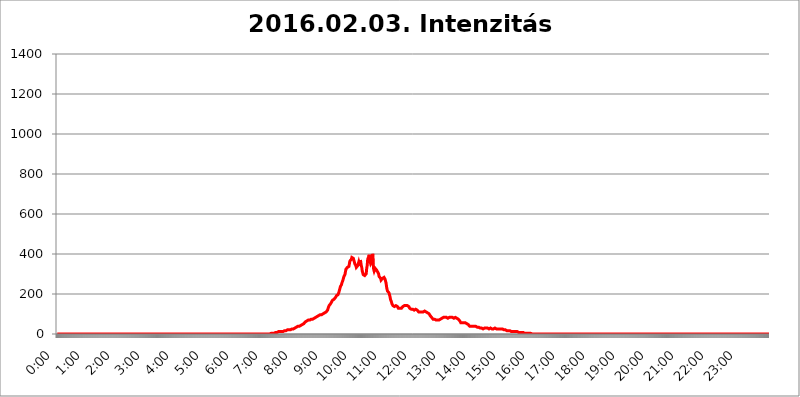
| Category | 2016.02.03. Intenzitás [W/m^2] |
|---|---|
| 0.0 | 0 |
| 0.0006944444444444445 | 0 |
| 0.001388888888888889 | 0 |
| 0.0020833333333333333 | 0 |
| 0.002777777777777778 | 0 |
| 0.003472222222222222 | 0 |
| 0.004166666666666667 | 0 |
| 0.004861111111111111 | 0 |
| 0.005555555555555556 | 0 |
| 0.0062499999999999995 | 0 |
| 0.006944444444444444 | 0 |
| 0.007638888888888889 | 0 |
| 0.008333333333333333 | 0 |
| 0.009027777777777779 | 0 |
| 0.009722222222222222 | 0 |
| 0.010416666666666666 | 0 |
| 0.011111111111111112 | 0 |
| 0.011805555555555555 | 0 |
| 0.012499999999999999 | 0 |
| 0.013194444444444444 | 0 |
| 0.013888888888888888 | 0 |
| 0.014583333333333332 | 0 |
| 0.015277777777777777 | 0 |
| 0.015972222222222224 | 0 |
| 0.016666666666666666 | 0 |
| 0.017361111111111112 | 0 |
| 0.018055555555555557 | 0 |
| 0.01875 | 0 |
| 0.019444444444444445 | 0 |
| 0.02013888888888889 | 0 |
| 0.020833333333333332 | 0 |
| 0.02152777777777778 | 0 |
| 0.022222222222222223 | 0 |
| 0.02291666666666667 | 0 |
| 0.02361111111111111 | 0 |
| 0.024305555555555556 | 0 |
| 0.024999999999999998 | 0 |
| 0.025694444444444447 | 0 |
| 0.02638888888888889 | 0 |
| 0.027083333333333334 | 0 |
| 0.027777777777777776 | 0 |
| 0.02847222222222222 | 0 |
| 0.029166666666666664 | 0 |
| 0.029861111111111113 | 0 |
| 0.030555555555555555 | 0 |
| 0.03125 | 0 |
| 0.03194444444444445 | 0 |
| 0.03263888888888889 | 0 |
| 0.03333333333333333 | 0 |
| 0.034027777777777775 | 0 |
| 0.034722222222222224 | 0 |
| 0.035416666666666666 | 0 |
| 0.036111111111111115 | 0 |
| 0.03680555555555556 | 0 |
| 0.0375 | 0 |
| 0.03819444444444444 | 0 |
| 0.03888888888888889 | 0 |
| 0.03958333333333333 | 0 |
| 0.04027777777777778 | 0 |
| 0.04097222222222222 | 0 |
| 0.041666666666666664 | 0 |
| 0.042361111111111106 | 0 |
| 0.04305555555555556 | 0 |
| 0.043750000000000004 | 0 |
| 0.044444444444444446 | 0 |
| 0.04513888888888889 | 0 |
| 0.04583333333333334 | 0 |
| 0.04652777777777778 | 0 |
| 0.04722222222222222 | 0 |
| 0.04791666666666666 | 0 |
| 0.04861111111111111 | 0 |
| 0.049305555555555554 | 0 |
| 0.049999999999999996 | 0 |
| 0.05069444444444445 | 0 |
| 0.051388888888888894 | 0 |
| 0.052083333333333336 | 0 |
| 0.05277777777777778 | 0 |
| 0.05347222222222222 | 0 |
| 0.05416666666666667 | 0 |
| 0.05486111111111111 | 0 |
| 0.05555555555555555 | 0 |
| 0.05625 | 0 |
| 0.05694444444444444 | 0 |
| 0.057638888888888885 | 0 |
| 0.05833333333333333 | 0 |
| 0.05902777777777778 | 0 |
| 0.059722222222222225 | 0 |
| 0.06041666666666667 | 0 |
| 0.061111111111111116 | 0 |
| 0.06180555555555556 | 0 |
| 0.0625 | 0 |
| 0.06319444444444444 | 0 |
| 0.06388888888888888 | 0 |
| 0.06458333333333334 | 0 |
| 0.06527777777777778 | 0 |
| 0.06597222222222222 | 0 |
| 0.06666666666666667 | 0 |
| 0.06736111111111111 | 0 |
| 0.06805555555555555 | 0 |
| 0.06874999999999999 | 0 |
| 0.06944444444444443 | 0 |
| 0.07013888888888889 | 0 |
| 0.07083333333333333 | 0 |
| 0.07152777777777779 | 0 |
| 0.07222222222222223 | 0 |
| 0.07291666666666667 | 0 |
| 0.07361111111111111 | 0 |
| 0.07430555555555556 | 0 |
| 0.075 | 0 |
| 0.07569444444444444 | 0 |
| 0.0763888888888889 | 0 |
| 0.07708333333333334 | 0 |
| 0.07777777777777778 | 0 |
| 0.07847222222222222 | 0 |
| 0.07916666666666666 | 0 |
| 0.0798611111111111 | 0 |
| 0.08055555555555556 | 0 |
| 0.08125 | 0 |
| 0.08194444444444444 | 0 |
| 0.08263888888888889 | 0 |
| 0.08333333333333333 | 0 |
| 0.08402777777777777 | 0 |
| 0.08472222222222221 | 0 |
| 0.08541666666666665 | 0 |
| 0.08611111111111112 | 0 |
| 0.08680555555555557 | 0 |
| 0.08750000000000001 | 0 |
| 0.08819444444444445 | 0 |
| 0.08888888888888889 | 0 |
| 0.08958333333333333 | 0 |
| 0.09027777777777778 | 0 |
| 0.09097222222222222 | 0 |
| 0.09166666666666667 | 0 |
| 0.09236111111111112 | 0 |
| 0.09305555555555556 | 0 |
| 0.09375 | 0 |
| 0.09444444444444444 | 0 |
| 0.09513888888888888 | 0 |
| 0.09583333333333333 | 0 |
| 0.09652777777777777 | 0 |
| 0.09722222222222222 | 0 |
| 0.09791666666666667 | 0 |
| 0.09861111111111111 | 0 |
| 0.09930555555555555 | 0 |
| 0.09999999999999999 | 0 |
| 0.10069444444444443 | 0 |
| 0.1013888888888889 | 0 |
| 0.10208333333333335 | 0 |
| 0.10277777777777779 | 0 |
| 0.10347222222222223 | 0 |
| 0.10416666666666667 | 0 |
| 0.10486111111111111 | 0 |
| 0.10555555555555556 | 0 |
| 0.10625 | 0 |
| 0.10694444444444444 | 0 |
| 0.1076388888888889 | 0 |
| 0.10833333333333334 | 0 |
| 0.10902777777777778 | 0 |
| 0.10972222222222222 | 0 |
| 0.1111111111111111 | 0 |
| 0.11180555555555556 | 0 |
| 0.11180555555555556 | 0 |
| 0.1125 | 0 |
| 0.11319444444444444 | 0 |
| 0.11388888888888889 | 0 |
| 0.11458333333333333 | 0 |
| 0.11527777777777777 | 0 |
| 0.11597222222222221 | 0 |
| 0.11666666666666665 | 0 |
| 0.1173611111111111 | 0 |
| 0.11805555555555557 | 0 |
| 0.11944444444444445 | 0 |
| 0.12013888888888889 | 0 |
| 0.12083333333333333 | 0 |
| 0.12152777777777778 | 0 |
| 0.12222222222222223 | 0 |
| 0.12291666666666667 | 0 |
| 0.12291666666666667 | 0 |
| 0.12361111111111112 | 0 |
| 0.12430555555555556 | 0 |
| 0.125 | 0 |
| 0.12569444444444444 | 0 |
| 0.12638888888888888 | 0 |
| 0.12708333333333333 | 0 |
| 0.16875 | 0 |
| 0.12847222222222224 | 0 |
| 0.12916666666666668 | 0 |
| 0.12986111111111112 | 0 |
| 0.13055555555555556 | 0 |
| 0.13125 | 0 |
| 0.13194444444444445 | 0 |
| 0.1326388888888889 | 0 |
| 0.13333333333333333 | 0 |
| 0.13402777777777777 | 0 |
| 0.13402777777777777 | 0 |
| 0.13472222222222222 | 0 |
| 0.13541666666666666 | 0 |
| 0.1361111111111111 | 0 |
| 0.13749999999999998 | 0 |
| 0.13819444444444443 | 0 |
| 0.1388888888888889 | 0 |
| 0.13958333333333334 | 0 |
| 0.14027777777777778 | 0 |
| 0.14097222222222222 | 0 |
| 0.14166666666666666 | 0 |
| 0.1423611111111111 | 0 |
| 0.14305555555555557 | 0 |
| 0.14375000000000002 | 0 |
| 0.14444444444444446 | 0 |
| 0.1451388888888889 | 0 |
| 0.1451388888888889 | 0 |
| 0.14652777777777778 | 0 |
| 0.14722222222222223 | 0 |
| 0.14791666666666667 | 0 |
| 0.1486111111111111 | 0 |
| 0.14930555555555555 | 0 |
| 0.15 | 0 |
| 0.15069444444444444 | 0 |
| 0.15138888888888888 | 0 |
| 0.15208333333333332 | 0 |
| 0.15277777777777776 | 0 |
| 0.15347222222222223 | 0 |
| 0.15416666666666667 | 0 |
| 0.15486111111111112 | 0 |
| 0.15555555555555556 | 0 |
| 0.15625 | 0 |
| 0.15694444444444444 | 0 |
| 0.15763888888888888 | 0 |
| 0.15833333333333333 | 0 |
| 0.15902777777777777 | 0 |
| 0.15972222222222224 | 0 |
| 0.16041666666666668 | 0 |
| 0.16111111111111112 | 0 |
| 0.16180555555555556 | 0 |
| 0.1625 | 0 |
| 0.16319444444444445 | 0 |
| 0.1638888888888889 | 0 |
| 0.16458333333333333 | 0 |
| 0.16527777777777777 | 0 |
| 0.16597222222222222 | 0 |
| 0.16666666666666666 | 0 |
| 0.1673611111111111 | 0 |
| 0.16805555555555554 | 0 |
| 0.16874999999999998 | 0 |
| 0.16944444444444443 | 0 |
| 0.17013888888888887 | 0 |
| 0.1708333333333333 | 0 |
| 0.17152777777777775 | 0 |
| 0.17222222222222225 | 0 |
| 0.1729166666666667 | 0 |
| 0.17361111111111113 | 0 |
| 0.17430555555555557 | 0 |
| 0.17500000000000002 | 0 |
| 0.17569444444444446 | 0 |
| 0.1763888888888889 | 0 |
| 0.17708333333333334 | 0 |
| 0.17777777777777778 | 0 |
| 0.17847222222222223 | 0 |
| 0.17916666666666667 | 0 |
| 0.1798611111111111 | 0 |
| 0.18055555555555555 | 0 |
| 0.18125 | 0 |
| 0.18194444444444444 | 0 |
| 0.1826388888888889 | 0 |
| 0.18333333333333335 | 0 |
| 0.1840277777777778 | 0 |
| 0.18472222222222223 | 0 |
| 0.18541666666666667 | 0 |
| 0.18611111111111112 | 0 |
| 0.18680555555555556 | 0 |
| 0.1875 | 0 |
| 0.18819444444444444 | 0 |
| 0.18888888888888888 | 0 |
| 0.18958333333333333 | 0 |
| 0.19027777777777777 | 0 |
| 0.1909722222222222 | 0 |
| 0.19166666666666665 | 0 |
| 0.19236111111111112 | 0 |
| 0.19305555555555554 | 0 |
| 0.19375 | 0 |
| 0.19444444444444445 | 0 |
| 0.1951388888888889 | 0 |
| 0.19583333333333333 | 0 |
| 0.19652777777777777 | 0 |
| 0.19722222222222222 | 0 |
| 0.19791666666666666 | 0 |
| 0.1986111111111111 | 0 |
| 0.19930555555555554 | 0 |
| 0.19999999999999998 | 0 |
| 0.20069444444444443 | 0 |
| 0.20138888888888887 | 0 |
| 0.2020833333333333 | 0 |
| 0.2027777777777778 | 0 |
| 0.2034722222222222 | 0 |
| 0.2041666666666667 | 0 |
| 0.20486111111111113 | 0 |
| 0.20555555555555557 | 0 |
| 0.20625000000000002 | 0 |
| 0.20694444444444446 | 0 |
| 0.2076388888888889 | 0 |
| 0.20833333333333334 | 0 |
| 0.20902777777777778 | 0 |
| 0.20972222222222223 | 0 |
| 0.21041666666666667 | 0 |
| 0.2111111111111111 | 0 |
| 0.21180555555555555 | 0 |
| 0.2125 | 0 |
| 0.21319444444444444 | 0 |
| 0.2138888888888889 | 0 |
| 0.21458333333333335 | 0 |
| 0.2152777777777778 | 0 |
| 0.21597222222222223 | 0 |
| 0.21666666666666667 | 0 |
| 0.21736111111111112 | 0 |
| 0.21805555555555556 | 0 |
| 0.21875 | 0 |
| 0.21944444444444444 | 0 |
| 0.22013888888888888 | 0 |
| 0.22083333333333333 | 0 |
| 0.22152777777777777 | 0 |
| 0.2222222222222222 | 0 |
| 0.22291666666666665 | 0 |
| 0.2236111111111111 | 0 |
| 0.22430555555555556 | 0 |
| 0.225 | 0 |
| 0.22569444444444445 | 0 |
| 0.2263888888888889 | 0 |
| 0.22708333333333333 | 0 |
| 0.22777777777777777 | 0 |
| 0.22847222222222222 | 0 |
| 0.22916666666666666 | 0 |
| 0.2298611111111111 | 0 |
| 0.23055555555555554 | 0 |
| 0.23124999999999998 | 0 |
| 0.23194444444444443 | 0 |
| 0.23263888888888887 | 0 |
| 0.2333333333333333 | 0 |
| 0.2340277777777778 | 0 |
| 0.2347222222222222 | 0 |
| 0.2354166666666667 | 0 |
| 0.23611111111111113 | 0 |
| 0.23680555555555557 | 0 |
| 0.23750000000000002 | 0 |
| 0.23819444444444446 | 0 |
| 0.2388888888888889 | 0 |
| 0.23958333333333334 | 0 |
| 0.24027777777777778 | 0 |
| 0.24097222222222223 | 0 |
| 0.24166666666666667 | 0 |
| 0.2423611111111111 | 0 |
| 0.24305555555555555 | 0 |
| 0.24375 | 0 |
| 0.24444444444444446 | 0 |
| 0.24513888888888888 | 0 |
| 0.24583333333333335 | 0 |
| 0.2465277777777778 | 0 |
| 0.24722222222222223 | 0 |
| 0.24791666666666667 | 0 |
| 0.24861111111111112 | 0 |
| 0.24930555555555556 | 0 |
| 0.25 | 0 |
| 0.25069444444444444 | 0 |
| 0.2513888888888889 | 0 |
| 0.2520833333333333 | 0 |
| 0.25277777777777777 | 0 |
| 0.2534722222222222 | 0 |
| 0.25416666666666665 | 0 |
| 0.2548611111111111 | 0 |
| 0.2555555555555556 | 0 |
| 0.25625000000000003 | 0 |
| 0.2569444444444445 | 0 |
| 0.2576388888888889 | 0 |
| 0.25833333333333336 | 0 |
| 0.2590277777777778 | 0 |
| 0.25972222222222224 | 0 |
| 0.2604166666666667 | 0 |
| 0.2611111111111111 | 0 |
| 0.26180555555555557 | 0 |
| 0.2625 | 0 |
| 0.26319444444444445 | 0 |
| 0.2638888888888889 | 0 |
| 0.26458333333333334 | 0 |
| 0.2652777777777778 | 0 |
| 0.2659722222222222 | 0 |
| 0.26666666666666666 | 0 |
| 0.2673611111111111 | 0 |
| 0.26805555555555555 | 0 |
| 0.26875 | 0 |
| 0.26944444444444443 | 0 |
| 0.2701388888888889 | 0 |
| 0.2708333333333333 | 0 |
| 0.27152777777777776 | 0 |
| 0.2722222222222222 | 0 |
| 0.27291666666666664 | 0 |
| 0.2736111111111111 | 0 |
| 0.2743055555555555 | 0 |
| 0.27499999999999997 | 0 |
| 0.27569444444444446 | 0 |
| 0.27638888888888885 | 0 |
| 0.27708333333333335 | 0 |
| 0.2777777777777778 | 0 |
| 0.27847222222222223 | 0 |
| 0.2791666666666667 | 0 |
| 0.2798611111111111 | 0 |
| 0.28055555555555556 | 0 |
| 0.28125 | 0 |
| 0.28194444444444444 | 0 |
| 0.2826388888888889 | 0 |
| 0.2833333333333333 | 0 |
| 0.28402777777777777 | 0 |
| 0.2847222222222222 | 0 |
| 0.28541666666666665 | 0 |
| 0.28611111111111115 | 0 |
| 0.28680555555555554 | 0 |
| 0.28750000000000003 | 0 |
| 0.2881944444444445 | 0 |
| 0.2888888888888889 | 0 |
| 0.28958333333333336 | 0 |
| 0.2902777777777778 | 0 |
| 0.29097222222222224 | 0 |
| 0.2916666666666667 | 0 |
| 0.2923611111111111 | 0 |
| 0.29305555555555557 | 0 |
| 0.29375 | 0 |
| 0.29444444444444445 | 0 |
| 0.2951388888888889 | 0 |
| 0.29583333333333334 | 0 |
| 0.2965277777777778 | 0 |
| 0.2972222222222222 | 0 |
| 0.29791666666666666 | 0 |
| 0.2986111111111111 | 3.525 |
| 0.29930555555555555 | 3.525 |
| 0.3 | 3.525 |
| 0.30069444444444443 | 3.525 |
| 0.3013888888888889 | 3.525 |
| 0.3020833333333333 | 3.525 |
| 0.30277777777777776 | 3.525 |
| 0.3034722222222222 | 3.525 |
| 0.30416666666666664 | 3.525 |
| 0.3048611111111111 | 3.525 |
| 0.3055555555555555 | 7.887 |
| 0.30624999999999997 | 7.887 |
| 0.3069444444444444 | 7.887 |
| 0.3076388888888889 | 7.887 |
| 0.30833333333333335 | 7.887 |
| 0.3090277777777778 | 12.257 |
| 0.30972222222222223 | 12.257 |
| 0.3104166666666667 | 12.257 |
| 0.3111111111111111 | 12.257 |
| 0.31180555555555556 | 12.257 |
| 0.3125 | 12.257 |
| 0.31319444444444444 | 12.257 |
| 0.3138888888888889 | 12.257 |
| 0.3145833333333333 | 12.257 |
| 0.31527777777777777 | 12.257 |
| 0.3159722222222222 | 12.257 |
| 0.31666666666666665 | 12.257 |
| 0.31736111111111115 | 16.636 |
| 0.31805555555555554 | 16.636 |
| 0.31875000000000003 | 16.636 |
| 0.3194444444444445 | 16.636 |
| 0.3201388888888889 | 16.636 |
| 0.32083333333333336 | 16.636 |
| 0.3215277777777778 | 16.636 |
| 0.32222222222222224 | 21.024 |
| 0.3229166666666667 | 21.024 |
| 0.3236111111111111 | 21.024 |
| 0.32430555555555557 | 21.024 |
| 0.325 | 21.024 |
| 0.32569444444444445 | 21.024 |
| 0.3263888888888889 | 21.024 |
| 0.32708333333333334 | 21.024 |
| 0.3277777777777778 | 21.024 |
| 0.3284722222222222 | 21.024 |
| 0.32916666666666666 | 25.419 |
| 0.3298611111111111 | 25.419 |
| 0.33055555555555555 | 25.419 |
| 0.33125 | 25.419 |
| 0.33194444444444443 | 25.419 |
| 0.3326388888888889 | 25.419 |
| 0.3333333333333333 | 29.823 |
| 0.3340277777777778 | 29.823 |
| 0.3347222222222222 | 29.823 |
| 0.3354166666666667 | 34.234 |
| 0.3361111111111111 | 34.234 |
| 0.3368055555555556 | 34.234 |
| 0.33749999999999997 | 38.653 |
| 0.33819444444444446 | 38.653 |
| 0.33888888888888885 | 38.653 |
| 0.33958333333333335 | 38.653 |
| 0.34027777777777773 | 38.653 |
| 0.34097222222222223 | 43.079 |
| 0.3416666666666666 | 43.079 |
| 0.3423611111111111 | 47.511 |
| 0.3430555555555555 | 47.511 |
| 0.34375 | 47.511 |
| 0.3444444444444445 | 51.951 |
| 0.3451388888888889 | 51.951 |
| 0.3458333333333334 | 51.951 |
| 0.34652777777777777 | 56.398 |
| 0.34722222222222227 | 56.398 |
| 0.34791666666666665 | 60.85 |
| 0.34861111111111115 | 60.85 |
| 0.34930555555555554 | 60.85 |
| 0.35000000000000003 | 65.31 |
| 0.3506944444444444 | 65.31 |
| 0.3513888888888889 | 69.775 |
| 0.3520833333333333 | 69.775 |
| 0.3527777777777778 | 69.775 |
| 0.3534722222222222 | 69.775 |
| 0.3541666666666667 | 69.775 |
| 0.3548611111111111 | 69.775 |
| 0.35555555555555557 | 69.775 |
| 0.35625 | 74.246 |
| 0.35694444444444445 | 74.246 |
| 0.3576388888888889 | 74.246 |
| 0.35833333333333334 | 74.246 |
| 0.3590277777777778 | 74.246 |
| 0.3597222222222222 | 74.246 |
| 0.36041666666666666 | 78.722 |
| 0.3611111111111111 | 78.722 |
| 0.36180555555555555 | 78.722 |
| 0.3625 | 83.205 |
| 0.36319444444444443 | 83.205 |
| 0.3638888888888889 | 87.692 |
| 0.3645833333333333 | 87.692 |
| 0.3652777777777778 | 92.184 |
| 0.3659722222222222 | 92.184 |
| 0.3666666666666667 | 92.184 |
| 0.3673611111111111 | 92.184 |
| 0.3680555555555556 | 96.682 |
| 0.36874999999999997 | 96.682 |
| 0.36944444444444446 | 96.682 |
| 0.37013888888888885 | 96.682 |
| 0.37083333333333335 | 96.682 |
| 0.37152777777777773 | 96.682 |
| 0.37222222222222223 | 101.184 |
| 0.3729166666666666 | 101.184 |
| 0.3736111111111111 | 101.184 |
| 0.3743055555555555 | 105.69 |
| 0.375 | 105.69 |
| 0.3756944444444445 | 105.69 |
| 0.3763888888888889 | 110.201 |
| 0.3770833333333334 | 110.201 |
| 0.37777777777777777 | 110.201 |
| 0.37847222222222227 | 114.716 |
| 0.37916666666666665 | 119.235 |
| 0.37986111111111115 | 128.284 |
| 0.38055555555555554 | 132.814 |
| 0.38125000000000003 | 141.884 |
| 0.3819444444444444 | 146.423 |
| 0.3826388888888889 | 146.423 |
| 0.3833333333333333 | 150.964 |
| 0.3840277777777778 | 155.509 |
| 0.3847222222222222 | 160.056 |
| 0.3854166666666667 | 164.605 |
| 0.3861111111111111 | 169.156 |
| 0.38680555555555557 | 173.709 |
| 0.3875 | 173.709 |
| 0.38819444444444445 | 173.709 |
| 0.3888888888888889 | 173.709 |
| 0.38958333333333334 | 178.264 |
| 0.3902777777777778 | 182.82 |
| 0.3909722222222222 | 187.378 |
| 0.39166666666666666 | 191.937 |
| 0.3923611111111111 | 191.937 |
| 0.39305555555555555 | 196.497 |
| 0.39375 | 196.497 |
| 0.39444444444444443 | 201.058 |
| 0.3951388888888889 | 210.182 |
| 0.3958333333333333 | 219.309 |
| 0.3965277777777778 | 228.436 |
| 0.3972222222222222 | 237.564 |
| 0.3979166666666667 | 242.127 |
| 0.3986111111111111 | 246.689 |
| 0.3993055555555556 | 255.813 |
| 0.39999999999999997 | 260.373 |
| 0.40069444444444446 | 269.49 |
| 0.40138888888888885 | 278.603 |
| 0.40208333333333335 | 287.709 |
| 0.40277777777777773 | 292.259 |
| 0.40347222222222223 | 296.808 |
| 0.4041666666666666 | 310.44 |
| 0.4048611111111111 | 324.052 |
| 0.4055555555555555 | 328.584 |
| 0.40625 | 328.584 |
| 0.4069444444444445 | 333.113 |
| 0.4076388888888889 | 337.639 |
| 0.4083333333333334 | 333.113 |
| 0.40902777777777777 | 337.639 |
| 0.40972222222222227 | 351.198 |
| 0.41041666666666665 | 364.728 |
| 0.41111111111111115 | 369.23 |
| 0.41180555555555554 | 364.728 |
| 0.41250000000000003 | 373.729 |
| 0.4131944444444444 | 382.715 |
| 0.4138888888888889 | 382.715 |
| 0.4145833333333333 | 378.224 |
| 0.4152777777777778 | 378.224 |
| 0.4159722222222222 | 369.23 |
| 0.4166666666666667 | 364.728 |
| 0.4173611111111111 | 351.198 |
| 0.41805555555555557 | 346.682 |
| 0.41875 | 342.162 |
| 0.41944444444444445 | 333.113 |
| 0.4201388888888889 | 333.113 |
| 0.42083333333333334 | 337.639 |
| 0.4215277777777778 | 342.162 |
| 0.4222222222222222 | 342.162 |
| 0.42291666666666666 | 360.221 |
| 0.4236111111111111 | 355.712 |
| 0.42430555555555555 | 342.162 |
| 0.425 | 369.23 |
| 0.42569444444444443 | 360.221 |
| 0.4263888888888889 | 342.162 |
| 0.4270833333333333 | 333.113 |
| 0.4277777777777778 | 314.98 |
| 0.4284722222222222 | 305.898 |
| 0.4291666666666667 | 296.808 |
| 0.4298611111111111 | 292.259 |
| 0.4305555555555556 | 292.259 |
| 0.43124999999999997 | 292.259 |
| 0.43194444444444446 | 287.709 |
| 0.43263888888888885 | 292.259 |
| 0.43333333333333335 | 301.354 |
| 0.43402777777777773 | 328.584 |
| 0.43472222222222223 | 342.162 |
| 0.4354166666666666 | 373.729 |
| 0.4361111111111111 | 373.729 |
| 0.4368055555555555 | 387.202 |
| 0.4375 | 396.164 |
| 0.4381944444444445 | 382.715 |
| 0.4388888888888889 | 360.221 |
| 0.4395833333333334 | 351.198 |
| 0.44027777777777777 | 351.198 |
| 0.44097222222222227 | 360.221 |
| 0.44166666666666665 | 364.728 |
| 0.44236111111111115 | 400.638 |
| 0.44305555555555554 | 351.198 |
| 0.44375000000000003 | 324.052 |
| 0.4444444444444444 | 314.98 |
| 0.4451388888888889 | 314.98 |
| 0.4458333333333333 | 328.584 |
| 0.4465277777777778 | 324.052 |
| 0.4472222222222222 | 324.052 |
| 0.4479166666666667 | 319.517 |
| 0.4486111111111111 | 314.98 |
| 0.44930555555555557 | 310.44 |
| 0.45 | 305.898 |
| 0.45069444444444445 | 301.354 |
| 0.4513888888888889 | 287.709 |
| 0.45208333333333334 | 283.156 |
| 0.4527777777777778 | 287.709 |
| 0.4534722222222222 | 278.603 |
| 0.45416666666666666 | 269.49 |
| 0.4548611111111111 | 269.49 |
| 0.45555555555555555 | 274.047 |
| 0.45625 | 278.603 |
| 0.45694444444444443 | 283.156 |
| 0.4576388888888889 | 283.156 |
| 0.4583333333333333 | 283.156 |
| 0.4590277777777778 | 278.603 |
| 0.4597222222222222 | 274.047 |
| 0.4604166666666667 | 264.932 |
| 0.4611111111111111 | 255.813 |
| 0.4618055555555556 | 237.564 |
| 0.46249999999999997 | 223.873 |
| 0.46319444444444446 | 214.746 |
| 0.46388888888888885 | 214.746 |
| 0.46458333333333335 | 210.182 |
| 0.46527777777777773 | 205.62 |
| 0.46597222222222223 | 196.497 |
| 0.4666666666666666 | 187.378 |
| 0.4673611111111111 | 173.709 |
| 0.4680555555555555 | 169.156 |
| 0.46875 | 160.056 |
| 0.4694444444444445 | 150.964 |
| 0.4701388888888889 | 146.423 |
| 0.4708333333333334 | 141.884 |
| 0.47152777777777777 | 141.884 |
| 0.47222222222222227 | 141.884 |
| 0.47291666666666665 | 137.347 |
| 0.47361111111111115 | 141.884 |
| 0.47430555555555554 | 141.884 |
| 0.47500000000000003 | 141.884 |
| 0.4756944444444444 | 141.884 |
| 0.4763888888888889 | 137.347 |
| 0.4770833333333333 | 137.347 |
| 0.4777777777777778 | 132.814 |
| 0.4784722222222222 | 128.284 |
| 0.4791666666666667 | 128.284 |
| 0.4798611111111111 | 128.284 |
| 0.48055555555555557 | 128.284 |
| 0.48125 | 128.284 |
| 0.48194444444444445 | 128.284 |
| 0.4826388888888889 | 128.284 |
| 0.48333333333333334 | 132.814 |
| 0.4840277777777778 | 132.814 |
| 0.4847222222222222 | 137.347 |
| 0.48541666666666666 | 137.347 |
| 0.4861111111111111 | 141.884 |
| 0.48680555555555555 | 141.884 |
| 0.4875 | 137.347 |
| 0.48819444444444443 | 137.347 |
| 0.4888888888888889 | 141.884 |
| 0.4895833333333333 | 141.884 |
| 0.4902777777777778 | 141.884 |
| 0.4909722222222222 | 141.884 |
| 0.4916666666666667 | 141.884 |
| 0.4923611111111111 | 137.347 |
| 0.4930555555555556 | 137.347 |
| 0.49374999999999997 | 132.814 |
| 0.49444444444444446 | 128.284 |
| 0.49513888888888885 | 123.758 |
| 0.49583333333333335 | 123.758 |
| 0.49652777777777773 | 123.758 |
| 0.49722222222222223 | 123.758 |
| 0.4979166666666666 | 123.758 |
| 0.4986111111111111 | 123.758 |
| 0.4993055555555555 | 123.758 |
| 0.5 | 119.235 |
| 0.5006944444444444 | 119.235 |
| 0.5013888888888889 | 123.758 |
| 0.5020833333333333 | 123.758 |
| 0.5027777777777778 | 123.758 |
| 0.5034722222222222 | 123.758 |
| 0.5041666666666667 | 119.235 |
| 0.5048611111111111 | 119.235 |
| 0.5055555555555555 | 114.716 |
| 0.50625 | 114.716 |
| 0.5069444444444444 | 110.201 |
| 0.5076388888888889 | 110.201 |
| 0.5083333333333333 | 110.201 |
| 0.5090277777777777 | 110.201 |
| 0.5097222222222222 | 105.69 |
| 0.5104166666666666 | 110.201 |
| 0.5111111111111112 | 110.201 |
| 0.5118055555555555 | 110.201 |
| 0.5125000000000001 | 110.201 |
| 0.5131944444444444 | 110.201 |
| 0.513888888888889 | 110.201 |
| 0.5145833333333333 | 110.201 |
| 0.5152777777777778 | 114.716 |
| 0.5159722222222222 | 114.716 |
| 0.5166666666666667 | 110.201 |
| 0.517361111111111 | 110.201 |
| 0.5180555555555556 | 110.201 |
| 0.5187499999999999 | 110.201 |
| 0.5194444444444445 | 105.69 |
| 0.5201388888888888 | 101.184 |
| 0.5208333333333334 | 101.184 |
| 0.5215277777777778 | 101.184 |
| 0.5222222222222223 | 96.682 |
| 0.5229166666666667 | 92.184 |
| 0.5236111111111111 | 92.184 |
| 0.5243055555555556 | 87.692 |
| 0.525 | 83.205 |
| 0.5256944444444445 | 78.722 |
| 0.5263888888888889 | 78.722 |
| 0.5270833333333333 | 74.246 |
| 0.5277777777777778 | 74.246 |
| 0.5284722222222222 | 74.246 |
| 0.5291666666666667 | 74.246 |
| 0.5298611111111111 | 74.246 |
| 0.5305555555555556 | 69.775 |
| 0.53125 | 69.775 |
| 0.5319444444444444 | 69.775 |
| 0.5326388888888889 | 69.775 |
| 0.5333333333333333 | 69.775 |
| 0.5340277777777778 | 69.775 |
| 0.5347222222222222 | 69.775 |
| 0.5354166666666667 | 69.775 |
| 0.5361111111111111 | 69.775 |
| 0.5368055555555555 | 69.775 |
| 0.5375 | 74.246 |
| 0.5381944444444444 | 74.246 |
| 0.5388888888888889 | 74.246 |
| 0.5395833333333333 | 78.722 |
| 0.5402777777777777 | 83.205 |
| 0.5409722222222222 | 83.205 |
| 0.5416666666666666 | 83.205 |
| 0.5423611111111112 | 83.205 |
| 0.5430555555555555 | 87.692 |
| 0.5437500000000001 | 83.205 |
| 0.5444444444444444 | 83.205 |
| 0.545138888888889 | 83.205 |
| 0.5458333333333333 | 83.205 |
| 0.5465277777777778 | 83.205 |
| 0.5472222222222222 | 83.205 |
| 0.5479166666666667 | 78.722 |
| 0.548611111111111 | 83.205 |
| 0.5493055555555556 | 83.205 |
| 0.5499999999999999 | 83.205 |
| 0.5506944444444445 | 83.205 |
| 0.5513888888888888 | 83.205 |
| 0.5520833333333334 | 83.205 |
| 0.5527777777777778 | 83.205 |
| 0.5534722222222223 | 83.205 |
| 0.5541666666666667 | 83.205 |
| 0.5548611111111111 | 83.205 |
| 0.5555555555555556 | 83.205 |
| 0.55625 | 78.722 |
| 0.5569444444444445 | 78.722 |
| 0.5576388888888889 | 83.205 |
| 0.5583333333333333 | 83.205 |
| 0.5590277777777778 | 78.722 |
| 0.5597222222222222 | 78.722 |
| 0.5604166666666667 | 78.722 |
| 0.5611111111111111 | 74.246 |
| 0.5618055555555556 | 74.246 |
| 0.5625 | 74.246 |
| 0.5631944444444444 | 69.775 |
| 0.5638888888888889 | 69.775 |
| 0.5645833333333333 | 65.31 |
| 0.5652777777777778 | 60.85 |
| 0.5659722222222222 | 56.398 |
| 0.5666666666666667 | 56.398 |
| 0.5673611111111111 | 56.398 |
| 0.5680555555555555 | 56.398 |
| 0.56875 | 56.398 |
| 0.5694444444444444 | 56.398 |
| 0.5701388888888889 | 56.398 |
| 0.5708333333333333 | 56.398 |
| 0.5715277777777777 | 56.398 |
| 0.5722222222222222 | 56.398 |
| 0.5729166666666666 | 56.398 |
| 0.5736111111111112 | 56.398 |
| 0.5743055555555555 | 51.951 |
| 0.5750000000000001 | 51.951 |
| 0.5756944444444444 | 47.511 |
| 0.576388888888889 | 47.511 |
| 0.5770833333333333 | 47.511 |
| 0.5777777777777778 | 43.079 |
| 0.5784722222222222 | 38.653 |
| 0.5791666666666667 | 38.653 |
| 0.579861111111111 | 38.653 |
| 0.5805555555555556 | 38.653 |
| 0.5812499999999999 | 38.653 |
| 0.5819444444444445 | 38.653 |
| 0.5826388888888888 | 38.653 |
| 0.5833333333333334 | 38.653 |
| 0.5840277777777778 | 38.653 |
| 0.5847222222222223 | 38.653 |
| 0.5854166666666667 | 38.653 |
| 0.5861111111111111 | 38.653 |
| 0.5868055555555556 | 38.653 |
| 0.5875 | 38.653 |
| 0.5881944444444445 | 34.234 |
| 0.5888888888888889 | 34.234 |
| 0.5895833333333333 | 34.234 |
| 0.5902777777777778 | 34.234 |
| 0.5909722222222222 | 34.234 |
| 0.5916666666666667 | 34.234 |
| 0.5923611111111111 | 29.823 |
| 0.5930555555555556 | 29.823 |
| 0.59375 | 29.823 |
| 0.5944444444444444 | 29.823 |
| 0.5951388888888889 | 29.823 |
| 0.5958333333333333 | 25.419 |
| 0.5965277777777778 | 25.419 |
| 0.5972222222222222 | 25.419 |
| 0.5979166666666667 | 25.419 |
| 0.5986111111111111 | 25.419 |
| 0.5993055555555555 | 29.823 |
| 0.6 | 29.823 |
| 0.6006944444444444 | 29.823 |
| 0.6013888888888889 | 29.823 |
| 0.6020833333333333 | 29.823 |
| 0.6027777777777777 | 29.823 |
| 0.6034722222222222 | 29.823 |
| 0.6041666666666666 | 29.823 |
| 0.6048611111111112 | 29.823 |
| 0.6055555555555555 | 25.419 |
| 0.6062500000000001 | 25.419 |
| 0.6069444444444444 | 29.823 |
| 0.607638888888889 | 29.823 |
| 0.6083333333333333 | 29.823 |
| 0.6090277777777778 | 29.823 |
| 0.6097222222222222 | 25.419 |
| 0.6104166666666667 | 29.823 |
| 0.611111111111111 | 29.823 |
| 0.6118055555555556 | 25.419 |
| 0.6124999999999999 | 25.419 |
| 0.6131944444444445 | 25.419 |
| 0.6138888888888888 | 29.823 |
| 0.6145833333333334 | 29.823 |
| 0.6152777777777778 | 25.419 |
| 0.6159722222222223 | 25.419 |
| 0.6166666666666667 | 25.419 |
| 0.6173611111111111 | 25.419 |
| 0.6180555555555556 | 25.419 |
| 0.61875 | 25.419 |
| 0.6194444444444445 | 25.419 |
| 0.6201388888888889 | 25.419 |
| 0.6208333333333333 | 25.419 |
| 0.6215277777777778 | 25.419 |
| 0.6222222222222222 | 25.419 |
| 0.6229166666666667 | 25.419 |
| 0.6236111111111111 | 25.419 |
| 0.6243055555555556 | 25.419 |
| 0.625 | 25.419 |
| 0.6256944444444444 | 21.024 |
| 0.6263888888888889 | 21.024 |
| 0.6270833333333333 | 21.024 |
| 0.6277777777777778 | 21.024 |
| 0.6284722222222222 | 21.024 |
| 0.6291666666666667 | 21.024 |
| 0.6298611111111111 | 21.024 |
| 0.6305555555555555 | 16.636 |
| 0.63125 | 16.636 |
| 0.6319444444444444 | 16.636 |
| 0.6326388888888889 | 16.636 |
| 0.6333333333333333 | 16.636 |
| 0.6340277777777777 | 12.257 |
| 0.6347222222222222 | 16.636 |
| 0.6354166666666666 | 12.257 |
| 0.6361111111111112 | 12.257 |
| 0.6368055555555555 | 12.257 |
| 0.6375000000000001 | 12.257 |
| 0.6381944444444444 | 12.257 |
| 0.638888888888889 | 12.257 |
| 0.6395833333333333 | 12.257 |
| 0.6402777777777778 | 12.257 |
| 0.6409722222222222 | 12.257 |
| 0.6416666666666667 | 12.257 |
| 0.642361111111111 | 12.257 |
| 0.6430555555555556 | 12.257 |
| 0.6437499999999999 | 12.257 |
| 0.6444444444444445 | 12.257 |
| 0.6451388888888888 | 12.257 |
| 0.6458333333333334 | 12.257 |
| 0.6465277777777778 | 12.257 |
| 0.6472222222222223 | 7.887 |
| 0.6479166666666667 | 7.887 |
| 0.6486111111111111 | 7.887 |
| 0.6493055555555556 | 7.887 |
| 0.65 | 7.887 |
| 0.6506944444444445 | 7.887 |
| 0.6513888888888889 | 7.887 |
| 0.6520833333333333 | 7.887 |
| 0.6527777777777778 | 7.887 |
| 0.6534722222222222 | 7.887 |
| 0.6541666666666667 | 7.887 |
| 0.6548611111111111 | 3.525 |
| 0.6555555555555556 | 3.525 |
| 0.65625 | 3.525 |
| 0.6569444444444444 | 3.525 |
| 0.6576388888888889 | 3.525 |
| 0.6583333333333333 | 3.525 |
| 0.6590277777777778 | 3.525 |
| 0.6597222222222222 | 3.525 |
| 0.6604166666666667 | 3.525 |
| 0.6611111111111111 | 3.525 |
| 0.6618055555555555 | 3.525 |
| 0.6625 | 3.525 |
| 0.6631944444444444 | 3.525 |
| 0.6638888888888889 | 3.525 |
| 0.6645833333333333 | 3.525 |
| 0.6652777777777777 | 0 |
| 0.6659722222222222 | 0 |
| 0.6666666666666666 | 0 |
| 0.6673611111111111 | 0 |
| 0.6680555555555556 | 0 |
| 0.6687500000000001 | 0 |
| 0.6694444444444444 | 0 |
| 0.6701388888888888 | 0 |
| 0.6708333333333334 | 0 |
| 0.6715277777777778 | 0 |
| 0.6722222222222222 | 0 |
| 0.6729166666666666 | 0 |
| 0.6736111111111112 | 0 |
| 0.6743055555555556 | 0 |
| 0.6749999999999999 | 0 |
| 0.6756944444444444 | 0 |
| 0.6763888888888889 | 0 |
| 0.6770833333333334 | 0 |
| 0.6777777777777777 | 0 |
| 0.6784722222222223 | 0 |
| 0.6791666666666667 | 0 |
| 0.6798611111111111 | 0 |
| 0.6805555555555555 | 0 |
| 0.68125 | 0 |
| 0.6819444444444445 | 0 |
| 0.6826388888888889 | 0 |
| 0.6833333333333332 | 0 |
| 0.6840277777777778 | 0 |
| 0.6847222222222222 | 0 |
| 0.6854166666666667 | 0 |
| 0.686111111111111 | 0 |
| 0.6868055555555556 | 0 |
| 0.6875 | 0 |
| 0.6881944444444444 | 0 |
| 0.688888888888889 | 0 |
| 0.6895833333333333 | 0 |
| 0.6902777777777778 | 0 |
| 0.6909722222222222 | 0 |
| 0.6916666666666668 | 0 |
| 0.6923611111111111 | 0 |
| 0.6930555555555555 | 0 |
| 0.69375 | 0 |
| 0.6944444444444445 | 0 |
| 0.6951388888888889 | 0 |
| 0.6958333333333333 | 0 |
| 0.6965277777777777 | 0 |
| 0.6972222222222223 | 0 |
| 0.6979166666666666 | 0 |
| 0.6986111111111111 | 0 |
| 0.6993055555555556 | 0 |
| 0.7000000000000001 | 0 |
| 0.7006944444444444 | 0 |
| 0.7013888888888888 | 0 |
| 0.7020833333333334 | 0 |
| 0.7027777777777778 | 0 |
| 0.7034722222222222 | 0 |
| 0.7041666666666666 | 0 |
| 0.7048611111111112 | 0 |
| 0.7055555555555556 | 0 |
| 0.7062499999999999 | 0 |
| 0.7069444444444444 | 0 |
| 0.7076388888888889 | 0 |
| 0.7083333333333334 | 0 |
| 0.7090277777777777 | 0 |
| 0.7097222222222223 | 0 |
| 0.7104166666666667 | 0 |
| 0.7111111111111111 | 0 |
| 0.7118055555555555 | 0 |
| 0.7125 | 0 |
| 0.7131944444444445 | 0 |
| 0.7138888888888889 | 0 |
| 0.7145833333333332 | 0 |
| 0.7152777777777778 | 0 |
| 0.7159722222222222 | 0 |
| 0.7166666666666667 | 0 |
| 0.717361111111111 | 0 |
| 0.7180555555555556 | 0 |
| 0.71875 | 0 |
| 0.7194444444444444 | 0 |
| 0.720138888888889 | 0 |
| 0.7208333333333333 | 0 |
| 0.7215277777777778 | 0 |
| 0.7222222222222222 | 0 |
| 0.7229166666666668 | 0 |
| 0.7236111111111111 | 0 |
| 0.7243055555555555 | 0 |
| 0.725 | 0 |
| 0.7256944444444445 | 0 |
| 0.7263888888888889 | 0 |
| 0.7270833333333333 | 0 |
| 0.7277777777777777 | 0 |
| 0.7284722222222223 | 0 |
| 0.7291666666666666 | 0 |
| 0.7298611111111111 | 0 |
| 0.7305555555555556 | 0 |
| 0.7312500000000001 | 0 |
| 0.7319444444444444 | 0 |
| 0.7326388888888888 | 0 |
| 0.7333333333333334 | 0 |
| 0.7340277777777778 | 0 |
| 0.7347222222222222 | 0 |
| 0.7354166666666666 | 0 |
| 0.7361111111111112 | 0 |
| 0.7368055555555556 | 0 |
| 0.7374999999999999 | 0 |
| 0.7381944444444444 | 0 |
| 0.7388888888888889 | 0 |
| 0.7395833333333334 | 0 |
| 0.7402777777777777 | 0 |
| 0.7409722222222223 | 0 |
| 0.7416666666666667 | 0 |
| 0.7423611111111111 | 0 |
| 0.7430555555555555 | 0 |
| 0.74375 | 0 |
| 0.7444444444444445 | 0 |
| 0.7451388888888889 | 0 |
| 0.7458333333333332 | 0 |
| 0.7465277777777778 | 0 |
| 0.7472222222222222 | 0 |
| 0.7479166666666667 | 0 |
| 0.748611111111111 | 0 |
| 0.7493055555555556 | 0 |
| 0.75 | 0 |
| 0.7506944444444444 | 0 |
| 0.751388888888889 | 0 |
| 0.7520833333333333 | 0 |
| 0.7527777777777778 | 0 |
| 0.7534722222222222 | 0 |
| 0.7541666666666668 | 0 |
| 0.7548611111111111 | 0 |
| 0.7555555555555555 | 0 |
| 0.75625 | 0 |
| 0.7569444444444445 | 0 |
| 0.7576388888888889 | 0 |
| 0.7583333333333333 | 0 |
| 0.7590277777777777 | 0 |
| 0.7597222222222223 | 0 |
| 0.7604166666666666 | 0 |
| 0.7611111111111111 | 0 |
| 0.7618055555555556 | 0 |
| 0.7625000000000001 | 0 |
| 0.7631944444444444 | 0 |
| 0.7638888888888888 | 0 |
| 0.7645833333333334 | 0 |
| 0.7652777777777778 | 0 |
| 0.7659722222222222 | 0 |
| 0.7666666666666666 | 0 |
| 0.7673611111111112 | 0 |
| 0.7680555555555556 | 0 |
| 0.7687499999999999 | 0 |
| 0.7694444444444444 | 0 |
| 0.7701388888888889 | 0 |
| 0.7708333333333334 | 0 |
| 0.7715277777777777 | 0 |
| 0.7722222222222223 | 0 |
| 0.7729166666666667 | 0 |
| 0.7736111111111111 | 0 |
| 0.7743055555555555 | 0 |
| 0.775 | 0 |
| 0.7756944444444445 | 0 |
| 0.7763888888888889 | 0 |
| 0.7770833333333332 | 0 |
| 0.7777777777777778 | 0 |
| 0.7784722222222222 | 0 |
| 0.7791666666666667 | 0 |
| 0.779861111111111 | 0 |
| 0.7805555555555556 | 0 |
| 0.78125 | 0 |
| 0.7819444444444444 | 0 |
| 0.782638888888889 | 0 |
| 0.7833333333333333 | 0 |
| 0.7840277777777778 | 0 |
| 0.7847222222222222 | 0 |
| 0.7854166666666668 | 0 |
| 0.7861111111111111 | 0 |
| 0.7868055555555555 | 0 |
| 0.7875 | 0 |
| 0.7881944444444445 | 0 |
| 0.7888888888888889 | 0 |
| 0.7895833333333333 | 0 |
| 0.7902777777777777 | 0 |
| 0.7909722222222223 | 0 |
| 0.7916666666666666 | 0 |
| 0.7923611111111111 | 0 |
| 0.7930555555555556 | 0 |
| 0.7937500000000001 | 0 |
| 0.7944444444444444 | 0 |
| 0.7951388888888888 | 0 |
| 0.7958333333333334 | 0 |
| 0.7965277777777778 | 0 |
| 0.7972222222222222 | 0 |
| 0.7979166666666666 | 0 |
| 0.7986111111111112 | 0 |
| 0.7993055555555556 | 0 |
| 0.7999999999999999 | 0 |
| 0.8006944444444444 | 0 |
| 0.8013888888888889 | 0 |
| 0.8020833333333334 | 0 |
| 0.8027777777777777 | 0 |
| 0.8034722222222223 | 0 |
| 0.8041666666666667 | 0 |
| 0.8048611111111111 | 0 |
| 0.8055555555555555 | 0 |
| 0.80625 | 0 |
| 0.8069444444444445 | 0 |
| 0.8076388888888889 | 0 |
| 0.8083333333333332 | 0 |
| 0.8090277777777778 | 0 |
| 0.8097222222222222 | 0 |
| 0.8104166666666667 | 0 |
| 0.811111111111111 | 0 |
| 0.8118055555555556 | 0 |
| 0.8125 | 0 |
| 0.8131944444444444 | 0 |
| 0.813888888888889 | 0 |
| 0.8145833333333333 | 0 |
| 0.8152777777777778 | 0 |
| 0.8159722222222222 | 0 |
| 0.8166666666666668 | 0 |
| 0.8173611111111111 | 0 |
| 0.8180555555555555 | 0 |
| 0.81875 | 0 |
| 0.8194444444444445 | 0 |
| 0.8201388888888889 | 0 |
| 0.8208333333333333 | 0 |
| 0.8215277777777777 | 0 |
| 0.8222222222222223 | 0 |
| 0.8229166666666666 | 0 |
| 0.8236111111111111 | 0 |
| 0.8243055555555556 | 0 |
| 0.8250000000000001 | 0 |
| 0.8256944444444444 | 0 |
| 0.8263888888888888 | 0 |
| 0.8270833333333334 | 0 |
| 0.8277777777777778 | 0 |
| 0.8284722222222222 | 0 |
| 0.8291666666666666 | 0 |
| 0.8298611111111112 | 0 |
| 0.8305555555555556 | 0 |
| 0.8312499999999999 | 0 |
| 0.8319444444444444 | 0 |
| 0.8326388888888889 | 0 |
| 0.8333333333333334 | 0 |
| 0.8340277777777777 | 0 |
| 0.8347222222222223 | 0 |
| 0.8354166666666667 | 0 |
| 0.8361111111111111 | 0 |
| 0.8368055555555555 | 0 |
| 0.8375 | 0 |
| 0.8381944444444445 | 0 |
| 0.8388888888888889 | 0 |
| 0.8395833333333332 | 0 |
| 0.8402777777777778 | 0 |
| 0.8409722222222222 | 0 |
| 0.8416666666666667 | 0 |
| 0.842361111111111 | 0 |
| 0.8430555555555556 | 0 |
| 0.84375 | 0 |
| 0.8444444444444444 | 0 |
| 0.845138888888889 | 0 |
| 0.8458333333333333 | 0 |
| 0.8465277777777778 | 0 |
| 0.8472222222222222 | 0 |
| 0.8479166666666668 | 0 |
| 0.8486111111111111 | 0 |
| 0.8493055555555555 | 0 |
| 0.85 | 0 |
| 0.8506944444444445 | 0 |
| 0.8513888888888889 | 0 |
| 0.8520833333333333 | 0 |
| 0.8527777777777777 | 0 |
| 0.8534722222222223 | 0 |
| 0.8541666666666666 | 0 |
| 0.8548611111111111 | 0 |
| 0.8555555555555556 | 0 |
| 0.8562500000000001 | 0 |
| 0.8569444444444444 | 0 |
| 0.8576388888888888 | 0 |
| 0.8583333333333334 | 0 |
| 0.8590277777777778 | 0 |
| 0.8597222222222222 | 0 |
| 0.8604166666666666 | 0 |
| 0.8611111111111112 | 0 |
| 0.8618055555555556 | 0 |
| 0.8624999999999999 | 0 |
| 0.8631944444444444 | 0 |
| 0.8638888888888889 | 0 |
| 0.8645833333333334 | 0 |
| 0.8652777777777777 | 0 |
| 0.8659722222222223 | 0 |
| 0.8666666666666667 | 0 |
| 0.8673611111111111 | 0 |
| 0.8680555555555555 | 0 |
| 0.86875 | 0 |
| 0.8694444444444445 | 0 |
| 0.8701388888888889 | 0 |
| 0.8708333333333332 | 0 |
| 0.8715277777777778 | 0 |
| 0.8722222222222222 | 0 |
| 0.8729166666666667 | 0 |
| 0.873611111111111 | 0 |
| 0.8743055555555556 | 0 |
| 0.875 | 0 |
| 0.8756944444444444 | 0 |
| 0.876388888888889 | 0 |
| 0.8770833333333333 | 0 |
| 0.8777777777777778 | 0 |
| 0.8784722222222222 | 0 |
| 0.8791666666666668 | 0 |
| 0.8798611111111111 | 0 |
| 0.8805555555555555 | 0 |
| 0.88125 | 0 |
| 0.8819444444444445 | 0 |
| 0.8826388888888889 | 0 |
| 0.8833333333333333 | 0 |
| 0.8840277777777777 | 0 |
| 0.8847222222222223 | 0 |
| 0.8854166666666666 | 0 |
| 0.8861111111111111 | 0 |
| 0.8868055555555556 | 0 |
| 0.8875000000000001 | 0 |
| 0.8881944444444444 | 0 |
| 0.8888888888888888 | 0 |
| 0.8895833333333334 | 0 |
| 0.8902777777777778 | 0 |
| 0.8909722222222222 | 0 |
| 0.8916666666666666 | 0 |
| 0.8923611111111112 | 0 |
| 0.8930555555555556 | 0 |
| 0.8937499999999999 | 0 |
| 0.8944444444444444 | 0 |
| 0.8951388888888889 | 0 |
| 0.8958333333333334 | 0 |
| 0.8965277777777777 | 0 |
| 0.8972222222222223 | 0 |
| 0.8979166666666667 | 0 |
| 0.8986111111111111 | 0 |
| 0.8993055555555555 | 0 |
| 0.9 | 0 |
| 0.9006944444444445 | 0 |
| 0.9013888888888889 | 0 |
| 0.9020833333333332 | 0 |
| 0.9027777777777778 | 0 |
| 0.9034722222222222 | 0 |
| 0.9041666666666667 | 0 |
| 0.904861111111111 | 0 |
| 0.9055555555555556 | 0 |
| 0.90625 | 0 |
| 0.9069444444444444 | 0 |
| 0.907638888888889 | 0 |
| 0.9083333333333333 | 0 |
| 0.9090277777777778 | 0 |
| 0.9097222222222222 | 0 |
| 0.9104166666666668 | 0 |
| 0.9111111111111111 | 0 |
| 0.9118055555555555 | 0 |
| 0.9125 | 0 |
| 0.9131944444444445 | 0 |
| 0.9138888888888889 | 0 |
| 0.9145833333333333 | 0 |
| 0.9152777777777777 | 0 |
| 0.9159722222222223 | 0 |
| 0.9166666666666666 | 0 |
| 0.9173611111111111 | 0 |
| 0.9180555555555556 | 0 |
| 0.9187500000000001 | 0 |
| 0.9194444444444444 | 0 |
| 0.9201388888888888 | 0 |
| 0.9208333333333334 | 0 |
| 0.9215277777777778 | 0 |
| 0.9222222222222222 | 0 |
| 0.9229166666666666 | 0 |
| 0.9236111111111112 | 0 |
| 0.9243055555555556 | 0 |
| 0.9249999999999999 | 0 |
| 0.9256944444444444 | 0 |
| 0.9263888888888889 | 0 |
| 0.9270833333333334 | 0 |
| 0.9277777777777777 | 0 |
| 0.9284722222222223 | 0 |
| 0.9291666666666667 | 0 |
| 0.9298611111111111 | 0 |
| 0.9305555555555555 | 0 |
| 0.93125 | 0 |
| 0.9319444444444445 | 0 |
| 0.9326388888888889 | 0 |
| 0.9333333333333332 | 0 |
| 0.9340277777777778 | 0 |
| 0.9347222222222222 | 0 |
| 0.9354166666666667 | 0 |
| 0.936111111111111 | 0 |
| 0.9368055555555556 | 0 |
| 0.9375 | 0 |
| 0.9381944444444444 | 0 |
| 0.938888888888889 | 0 |
| 0.9395833333333333 | 0 |
| 0.9402777777777778 | 0 |
| 0.9409722222222222 | 0 |
| 0.9416666666666668 | 0 |
| 0.9423611111111111 | 0 |
| 0.9430555555555555 | 0 |
| 0.94375 | 0 |
| 0.9444444444444445 | 0 |
| 0.9451388888888889 | 0 |
| 0.9458333333333333 | 0 |
| 0.9465277777777777 | 0 |
| 0.9472222222222223 | 0 |
| 0.9479166666666666 | 0 |
| 0.9486111111111111 | 0 |
| 0.9493055555555556 | 0 |
| 0.9500000000000001 | 0 |
| 0.9506944444444444 | 0 |
| 0.9513888888888888 | 0 |
| 0.9520833333333334 | 0 |
| 0.9527777777777778 | 0 |
| 0.9534722222222222 | 0 |
| 0.9541666666666666 | 0 |
| 0.9548611111111112 | 0 |
| 0.9555555555555556 | 0 |
| 0.9562499999999999 | 0 |
| 0.9569444444444444 | 0 |
| 0.9576388888888889 | 0 |
| 0.9583333333333334 | 0 |
| 0.9590277777777777 | 0 |
| 0.9597222222222223 | 0 |
| 0.9604166666666667 | 0 |
| 0.9611111111111111 | 0 |
| 0.9618055555555555 | 0 |
| 0.9625 | 0 |
| 0.9631944444444445 | 0 |
| 0.9638888888888889 | 0 |
| 0.9645833333333332 | 0 |
| 0.9652777777777778 | 0 |
| 0.9659722222222222 | 0 |
| 0.9666666666666667 | 0 |
| 0.967361111111111 | 0 |
| 0.9680555555555556 | 0 |
| 0.96875 | 0 |
| 0.9694444444444444 | 0 |
| 0.970138888888889 | 0 |
| 0.9708333333333333 | 0 |
| 0.9715277777777778 | 0 |
| 0.9722222222222222 | 0 |
| 0.9729166666666668 | 0 |
| 0.9736111111111111 | 0 |
| 0.9743055555555555 | 0 |
| 0.975 | 0 |
| 0.9756944444444445 | 0 |
| 0.9763888888888889 | 0 |
| 0.9770833333333333 | 0 |
| 0.9777777777777777 | 0 |
| 0.9784722222222223 | 0 |
| 0.9791666666666666 | 0 |
| 0.9798611111111111 | 0 |
| 0.9805555555555556 | 0 |
| 0.9812500000000001 | 0 |
| 0.9819444444444444 | 0 |
| 0.9826388888888888 | 0 |
| 0.9833333333333334 | 0 |
| 0.9840277777777778 | 0 |
| 0.9847222222222222 | 0 |
| 0.9854166666666666 | 0 |
| 0.9861111111111112 | 0 |
| 0.9868055555555556 | 0 |
| 0.9874999999999999 | 0 |
| 0.9881944444444444 | 0 |
| 0.9888888888888889 | 0 |
| 0.9895833333333334 | 0 |
| 0.9902777777777777 | 0 |
| 0.9909722222222223 | 0 |
| 0.9916666666666667 | 0 |
| 0.9923611111111111 | 0 |
| 0.9930555555555555 | 0 |
| 0.99375 | 0 |
| 0.9944444444444445 | 0 |
| 0.9951388888888889 | 0 |
| 0.9958333333333332 | 0 |
| 0.9965277777777778 | 0 |
| 0.9972222222222222 | 0 |
| 0.9979166666666667 | 0 |
| 0.998611111111111 | 0 |
| 0.9993055555555556 | 0 |